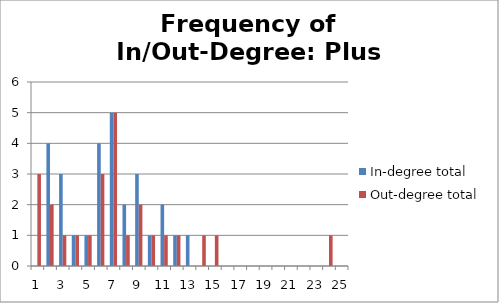
| Category | In-degree total | Out-degree total |
|---|---|---|
| 0 | 0 | 3 |
| 1 | 4 | 2 |
| 2 | 3 | 1 |
| 3 | 1 | 1 |
| 4 | 1 | 1 |
| 5 | 4 | 3 |
| 6 | 5 | 5 |
| 7 | 2 | 1 |
| 8 | 3 | 2 |
| 9 | 1 | 1 |
| 10 | 2 | 1 |
| 11 | 1 | 1 |
| 12 | 1 | 0 |
| 13 | 0 | 1 |
| 14 | 0 | 1 |
| 15 | 0 | 0 |
| 16 | 0 | 0 |
| 17 | 0 | 0 |
| 18 | 0 | 0 |
| 19 | 0 | 0 |
| 20 | 0 | 0 |
| 21 | 0 | 0 |
| 22 | 0 | 0 |
| 23 | 0 | 1 |
| 24 | 0 | 0 |